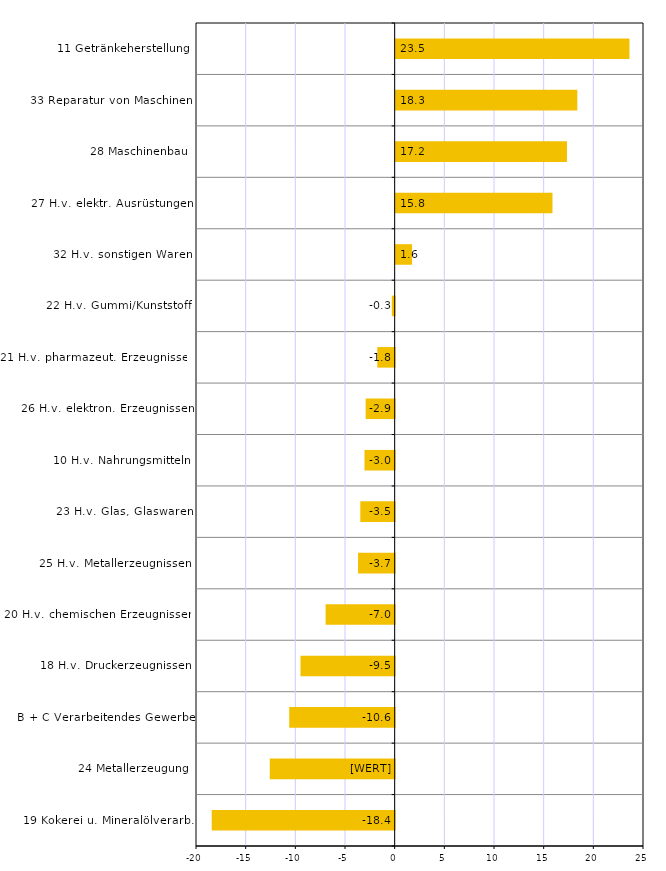
| Category | Series 2 |
|---|---|
| 19 Kokerei u. Mineralölverarb. | -18.418 |
| 24 Metallerzeugung | -12.575 |
| B + C Verarbeitendes Gewerbe | -10.615 |
| 18 H.v. Druckerzeugnissen | -9.481 |
| 20 H.v. chemischen Erzeugnissen | -6.952 |
| 25 H.v. Metallerzeugnissen | -3.687 |
| 23 H.v. Glas, Glaswaren | -3.457 |
| 10 H.v. Nahrungsmitteln | -3.039 |
| 26 H.v. elektron. Erzeugnissen | -2.919 |
| 21 H.v. pharmazeut. Erzeugnissen | -1.75 |
| 22 H.v. Gummi/Kunststoff | -0.285 |
| 32 H.v. sonstigen Waren | 1.648 |
| 27 H.v. elektr. Ausrüstungen | 15.786 |
| 28 Maschinenbau | 17.245 |
| 33 Reparatur von Maschinen | 18.286 |
| 11 Getränkeherstellung | 23.537 |